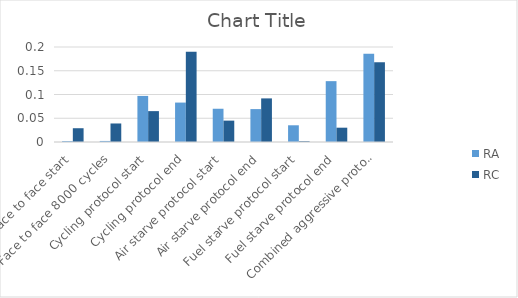
| Category | RA | RC |
|---|---|---|
| Face to face start | 0.002 | 0.029 |
| Face to face 8000 cycles | 0.002 | 0.039 |
| Cycling protocol start | 0.097 | 0.065 |
| Cycling protocol end | 0.083 | 0.19 |
| Air starve protocol start | 0.07 | 0.045 |
| Air starve protocol end | 0.069 | 0.092 |
| Fuel starve protocol start | 0.035 | 0.002 |
| Fuel starve protocol end | 0.128 | 0.03 |
| Combined aggressive protocol end | 0.186 | 0.168 |